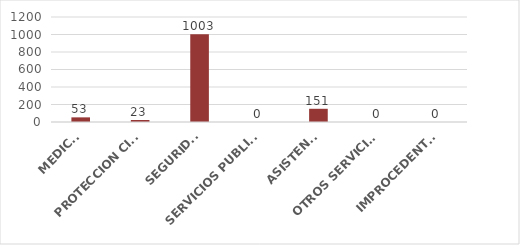
| Category | TOTAL |
|---|---|
| MEDICO | 53 |
| PROTECCION CIVIL | 23 |
| SEGURIDAD | 1003 |
| SERVICIOS PUBLICOS | 0 |
| ASISTENCIA | 151 |
| OTROS SERVICIOS | 0 |
| IMPROCEDENTES | 0 |